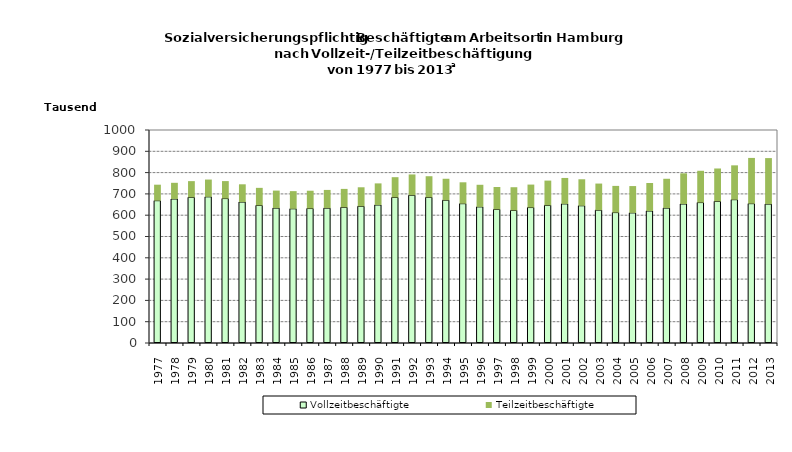
| Category | Vollzeitbeschäftigte | Teilzeitbeschäftigte |
|---|---|---|
| 1977.0 | 668123 | 75130 |
| 1978.0 | 676109 | 75959 |
| 1979.0 | 683705 | 76241 |
| 1980.0 | 686203 | 81164 |
| 1981.0 | 678057 | 82065 |
| 1982.0 | 661681 | 83383 |
| 1983.0 | 645847 | 82518 |
| 1984.0 | 633235 | 82282 |
| 1985.0 | 630081 | 82876 |
| 1986.0 | 631283 | 83594 |
| 1987.0 | 632985 | 85693 |
| 1988.0 | 636702 | 86798 |
| 1989.0 | 641681 | 89409 |
| 1990.0 | 647941 | 101424 |
| 1991.0 | 683094 | 95399 |
| 1992.0 | 693547 | 97804 |
| 1993.0 | 683689 | 99325 |
| 1994.0 | 670272 | 100836 |
| 1995.0 | 653998 | 100499 |
| 1996.0 | 638965 | 103857 |
| 1997.0 | 627192 | 105130 |
| 1998.0 | 622409 | 108954 |
| 1999.0 | 635915 | 107838 |
| 2000.0 | 646215 | 116256 |
| 2001.0 | 652961 | 121908 |
| 2002.0 | 644260 | 124427 |
| 2003.0 | 623539 | 125008 |
| 2004.0 | 612277 | 125285 |
| 2005.0 | 610795 | 125982 |
| 2006.0 | 619667 | 131459 |
| 2007.0 | 633311 | 137751 |
| 2008.0 | 652533 | 144061 |
| 2009.0 | 659237 | 149283 |
| 2010.0 | 664956 | 154370 |
| 2011.0 | 672796 | 161285 |
| 2012.0 | 654159 | 214736 |
| 2013.0 | 652034 | 216068 |